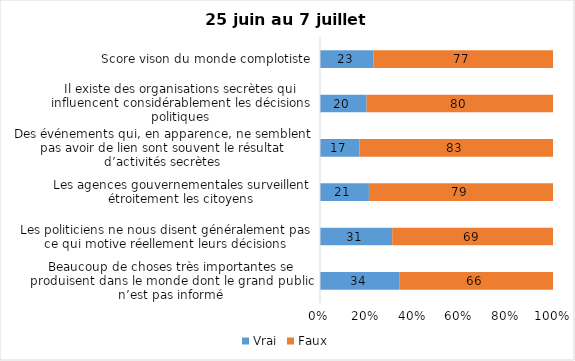
| Category | Vrai | Faux |
|---|---|---|
| Beaucoup de choses très importantes se produisent dans le monde dont le grand public n’est pas informé | 34 | 66 |
| Les politiciens ne nous disent généralement pas ce qui motive réellement leurs décisions | 31 | 69 |
| Les agences gouvernementales surveillent étroitement les citoyens | 21 | 79 |
| Des événements qui, en apparence, ne semblent pas avoir de lien sont souvent le résultat d’activités secrètes | 17 | 83 |
| Il existe des organisations secrètes qui influencent considérablement les décisions politiques | 20 | 80 |
| Score vison du monde complotiste | 23 | 77 |